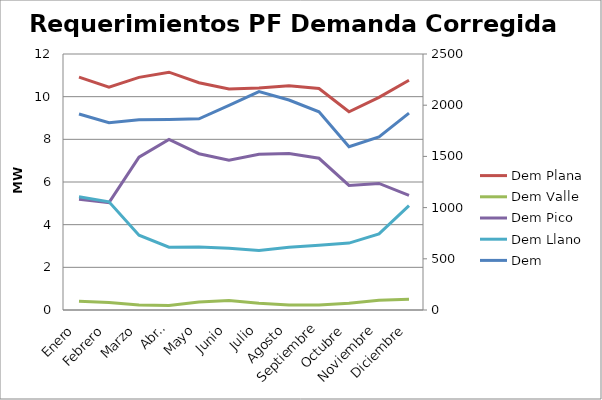
| Category | Dem Plana | Dem Valle | Dem Pico | Dem Llano |
|---|---|---|---|---|
| Enero | 10.915 | 0.415 | 5.193 | 5.308 |
| Febrero | 10.451 | 0.348 | 5.032 | 5.071 |
| Marzo | 10.903 | 0.235 | 7.165 | 3.504 |
| Abril | 11.147 | 0.208 | 7.991 | 2.947 |
| Mayo | 10.655 | 0.372 | 7.327 | 2.957 |
| Junio | 10.357 | 0.44 | 7.026 | 2.892 |
| Julio | 10.41 | 0.321 | 7.301 | 2.787 |
| Agosto | 10.512 | 0.237 | 7.337 | 2.938 |
| Septiembre | 10.384 | 0.237 | 7.112 | 3.036 |
| Octubre | 9.293 | 0.318 | 5.838 | 3.137 |
| Noviembre | 9.965 | 0.461 | 5.933 | 3.571 |
| Diciembre | 10.773 | 0.504 | 5.372 | 4.897 |